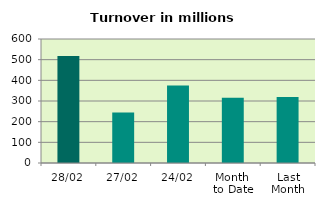
| Category | Series 0 |
|---|---|
| 28/02 | 517.643 |
| 27/02 | 244.682 |
| 24/02 | 374.767 |
| Month 
to Date | 316.082 |
| Last
Month | 318.977 |